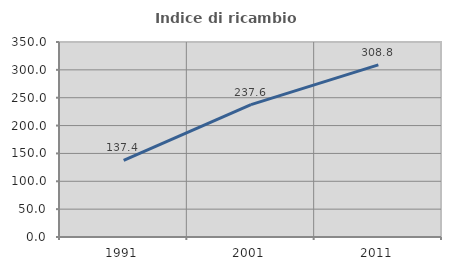
| Category | Indice di ricambio occupazionale  |
|---|---|
| 1991.0 | 137.433 |
| 2001.0 | 237.584 |
| 2011.0 | 308.844 |